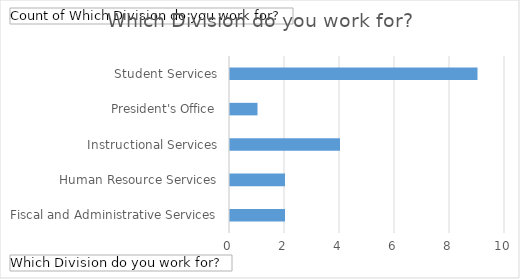
| Category | Total |
|---|---|
| Fiscal and Administrative Services | 2 |
| Human Resource Services | 2 |
| Instructional Services | 4 |
| President's Office | 1 |
| Student Services | 9 |